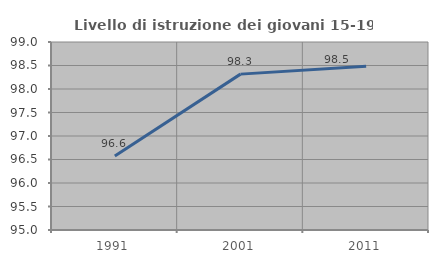
| Category | Livello di istruzione dei giovani 15-19 anni |
|---|---|
| 1991.0 | 96.573 |
| 2001.0 | 98.316 |
| 2011.0 | 98.485 |